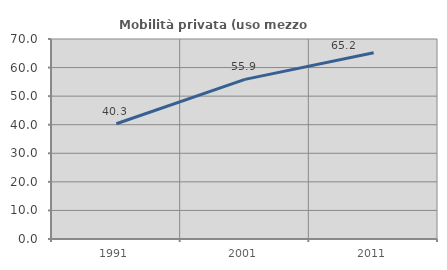
| Category | Mobilità privata (uso mezzo privato) |
|---|---|
| 1991.0 | 40.346 |
| 2001.0 | 55.866 |
| 2011.0 | 65.203 |